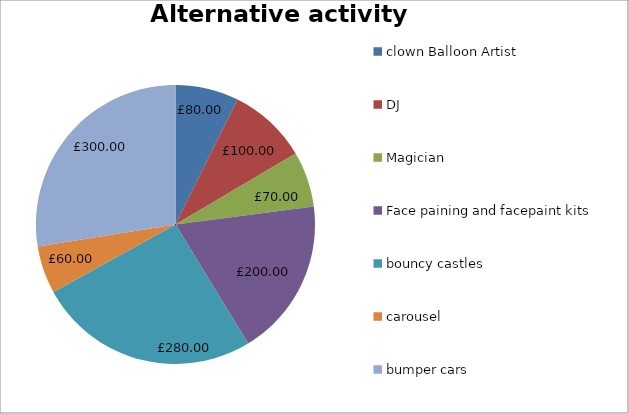
| Category | clown Balloon Artist DJ Magician Face paining and facepaint kits bouncy castles carousel bumper cars | Series 1 | £80.00 £100.00 £70.00 £200.00 £280.00 £60.00 £300.00 |
|---|---|---|---|
| clown Balloon Artist |  |  |  |
| DJ |  |  |  |
| Magician |  |  |  |
| Face paining and facepaint kits |  |  |  |
| bouncy castles |  |  |  |
| carousel |  |  |  |
| bumper cars |  |  |  |